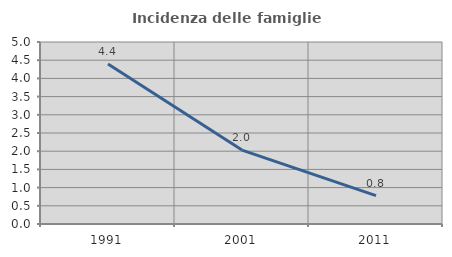
| Category | Incidenza delle famiglie numerose |
|---|---|
| 1991.0 | 4.396 |
| 2001.0 | 2.03 |
| 2011.0 | 0.78 |